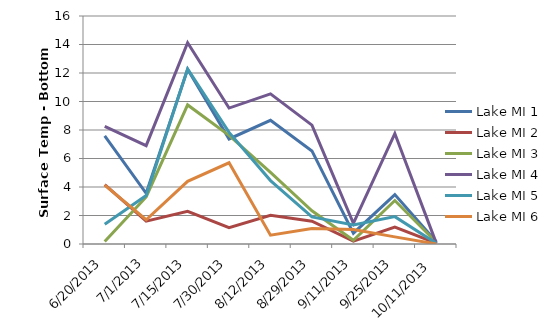
| Category | Lake MI 1 | Lake MI 2 | Lake MI 3 | Lake MI 4 | Lake MI 5 | Lake MI 6 |
|---|---|---|---|---|---|---|
| 6/20/13 | 7.58 | 4.16 | 0.17 | 8.25 | 1.39 | 4.13 |
| 7/1/13 | 3.56 | 1.6 | 3.3 | 6.9 | 3.4 | 1.7 |
| 7/15/13 | 12.26 | 2.29 | 9.76 | 14.12 | 12.28 | 4.4 |
| 7/30/13 | 7.37 | 1.15 | 7.62 | 9.54 | 7.83 | 5.7 |
| 8/12/13 | 8.68 | 2.01 | 5.02 | 10.54 | 4.45 | 0.62 |
| 8/29/13 | 6.53 | 1.6 | 2.33 | 8.34 | 1.9 | 1.09 |
| 9/11/13 | 0.76 | 0.2 | 0.26 | 1.45 | 1.34 | 1.01 |
| 9/25/13 | 3.47 | 1.18 | 3.05 | 7.75 | 1.92 | 0.5 |
| 10/11/13 | 0.15 | 0.06 | 0.12 | 0.06 | 0.05 | 0 |